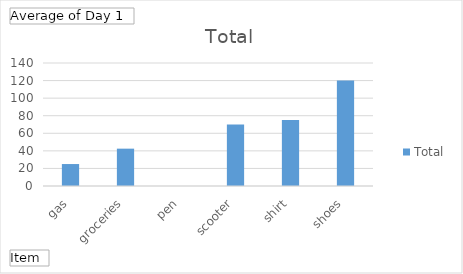
| Category | Total |
|---|---|
| gas | 25 |
| groceries | 42.5 |
| pen | 0 |
| scooter | 70 |
| shirt | 75 |
| shoes | 120 |